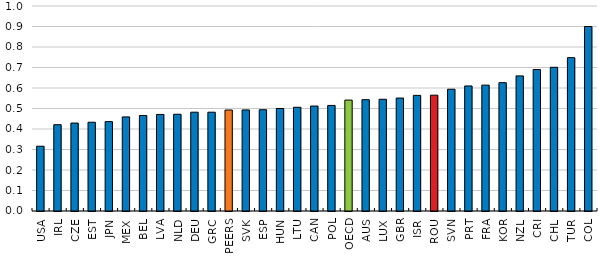
| Category | Series 0 |
|---|---|
| USA | 0.316 |
| IRL | 0.421 |
| CZE | 0.429 |
| EST | 0.433 |
| JPN | 0.436 |
| MEX | 0.459 |
| BEL | 0.466 |
| LVA | 0.471 |
| NLD | 0.472 |
| DEU | 0.482 |
| GRC | 0.482 |
| PEERS | 0.493 |
| SVK | 0.493 |
| ESP | 0.494 |
| HUN | 0.5 |
| LTU | 0.506 |
| CAN | 0.512 |
| POL | 0.515 |
| OECD | 0.541 |
| AUS | 0.543 |
| LUX | 0.545 |
| GBR | 0.551 |
| ISR | 0.564 |
| ROU | 0.565 |
| SVN | 0.594 |
| PRT | 0.61 |
| FRA | 0.614 |
| KOR | 0.626 |
| NZL | 0.659 |
| CRI | 0.69 |
| CHL | 0.701 |
| TUR | 0.748 |
| COL | 0.9 |